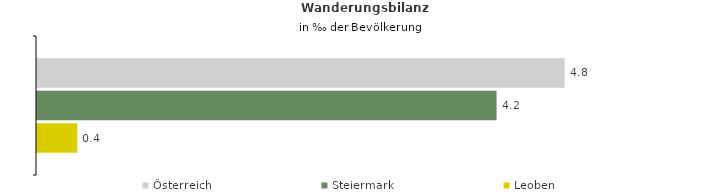
| Category | Österreich | Steiermark | Leoben |
|---|---|---|---|
| Wanderungsrate in ‰ der Bevölkerung, Periode 2017-2021 | 4.789 | 4.172 | 0.365 |